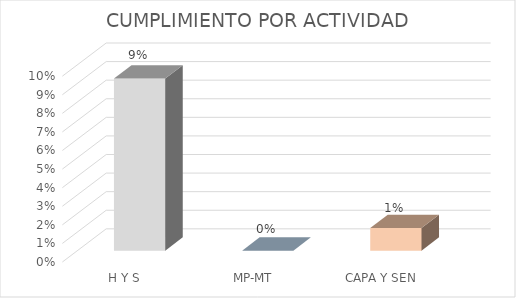
| Category | Cumplimiento |
|---|---|
| H Y S | 0.093 |
| MP-MT | 0 |
| CAPA Y SEN | 0.012 |